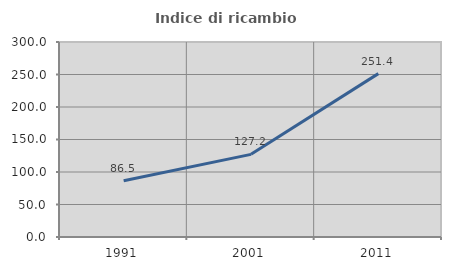
| Category | Indice di ricambio occupazionale  |
|---|---|
| 1991.0 | 86.511 |
| 2001.0 | 127.16 |
| 2011.0 | 251.367 |